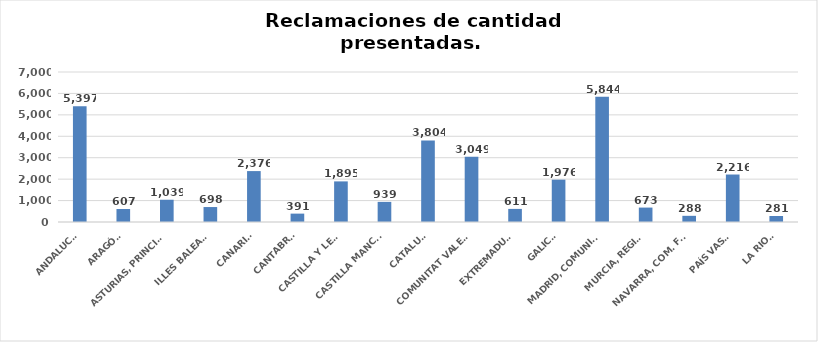
| Category | Series 0 |
|---|---|
| ANDALUCÍA | 5397 |
| ARAGÓN | 607 |
| ASTURIAS, PRINCIPADO | 1039 |
| ILLES BALEARS | 698 |
| CANARIAS | 2376 |
| CANTABRIA | 391 |
| CASTILLA Y LEÓN | 1895 |
| CASTILLA MANCHA | 939 |
| CATALUÑA | 3804 |
| COMUNITAT VALENCIANA | 3049 |
| EXTREMADURA | 611 |
| GALICIA | 1976 |
| MADRID, COMUNIDAD | 5844 |
| MURCIA, REGIÓN | 673 |
| NAVARRA, COM. FORAL | 288 |
| PAÍS VASCO | 2216 |
| LA RIOJA | 281 |